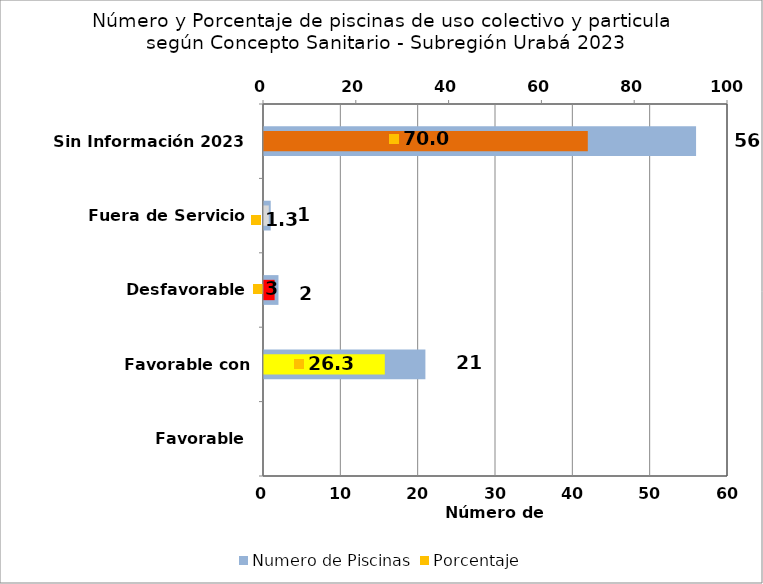
| Category | Numero de Piscinas |
|---|---|
| Favorable | 0 |
| Favorable con Requerimientos | 21 |
| Desfavorable | 2 |
| Fuera de Servicio | 1 |
| Sin Información 2023 | 56 |